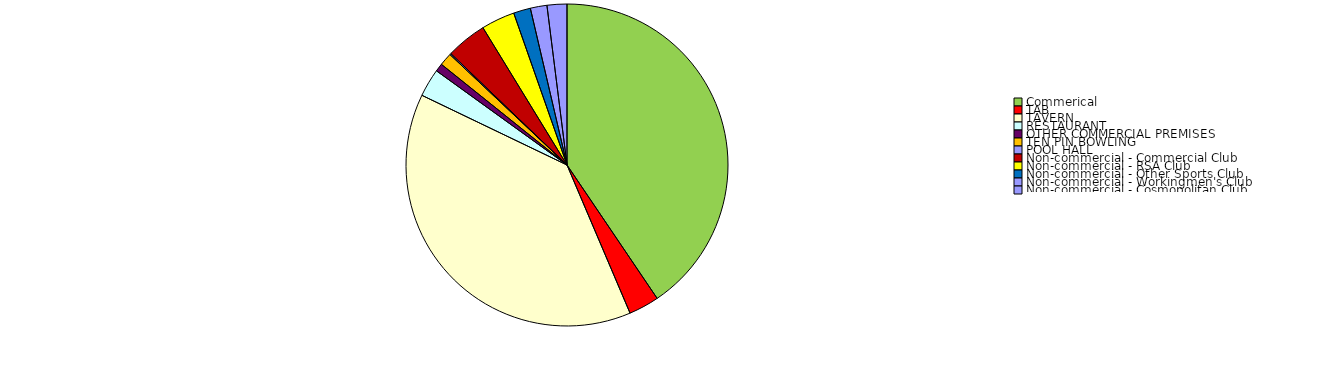
| Category | Series 0 |
|---|---|
| Commerical | 81111353.29 |
| TAB | 6113399.75 |
| TAVERN | 77091643.55 |
| RESTAURANT | 5640658.98 |
| OTHER COMMERCIAL PREMISES | 1617021.61 |
| TEN PIN BOWLING | 2571371.47 |
| POOL HALL | 257340.86 |
| Non-commercial - Commercial Club | 8178903 |
| Non-commercial - RSA Club | 6756756.38 |
| Non-commercial - Other Sports Club | 3421369.31 |
| Non-commercial - Workingmen's Club | 3335603.47 |
| Non-commercial - Cosmopolitan Club | 3983450.13 |